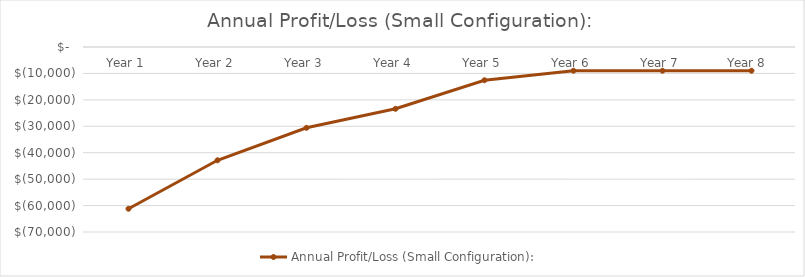
| Category | Annual Profit/Loss (Small Configuration):  |
|---|---|
| Year 1 | -61204.48 |
| Year 2 | -42870.48 |
| Year 3 | -30575.48 |
| Year 4 | -23375.48 |
| Year 5 | -12575.48 |
| Year 6 | -8975.48 |
| Year 7 | -8975.48 |
| Year 8  | -8975.48 |